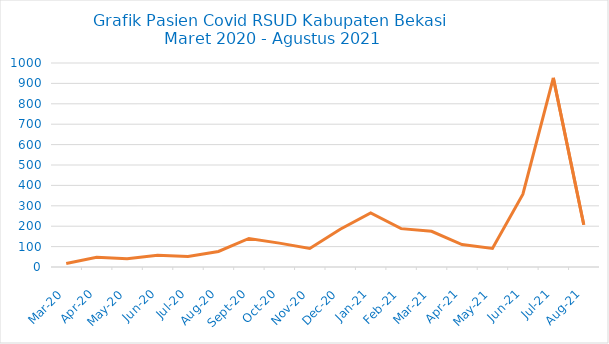
| Category | Series 0 |
|---|---|
| 2020-03-01 | 17 |
| 2020-04-01 | 48 |
| 2020-05-01 | 40 |
| 2020-06-01 | 58 |
| 2020-07-01 | 52 |
| 2020-08-01 | 76 |
| 2020-09-01 | 140 |
| 2020-10-01 | 117 |
| 2020-11-01 | 91 |
| 2020-12-01 | 185 |
| 2021-01-01 | 265 |
| 2021-02-01 | 188 |
| 2021-03-01 | 175 |
| 2021-04-01 | 110 |
| 2021-05-01 | 91 |
| 2021-06-01 | 357 |
| 2021-07-01 | 927 |
| 2021-08-01 | 207 |